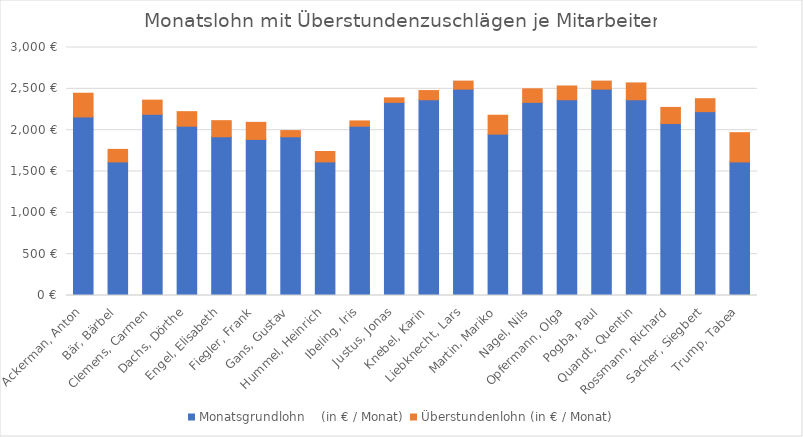
| Category | Monatsgrundlohn    (in € / Monat) | Überstundenlohn (in € / Monat) |
|---|---|---|
| Ackerman, Anton | 2160 | 286.875 |
| Bär, Bärbel | 1616 | 151.5 |
| Clemens, Carmen | 2192 | 171.25 |
| Dachs, Dörthe | 2048 | 176 |
| Engel, Elisabeth | 1920 | 195 |
| Fiegler, Frank | 1888 | 206.5 |
| Gans, Gustav | 1920 | 75 |
| Hummel, Heinrich | 1616 | 126.25 |
| Ibeling, Iris | 2048 | 64 |
| Justus, Jonas | 2336 | 54.75 |
| Knebel, Karin | 2368 | 111 |
| Liebknecht, Lars | 2496 | 97.5 |
| Martin, Mariko | 1952 | 228.75 |
| Nagel, Nils | 2336 | 164.25 |
| Opfermann, Olga | 2368 | 166.5 |
| Pogba, Paul | 2496 | 97.5 |
| Quandt, Quentin | 2368 | 203.5 |
| Rossmann, Richard | 2080 | 195 |
| Sacher, Siegbert | 2224 | 156.375 |
| Trump, Tabea | 1616 | 353.5 |